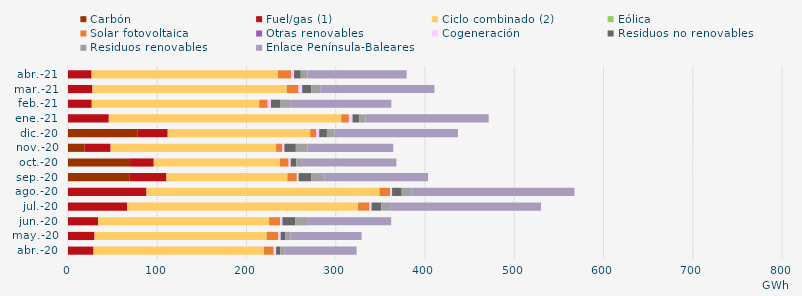
| Category | Carbón | Fuel/gas (1) | Ciclo combinado (2) | Eólica | Solar fotovoltaica | Otras renovables | Cogeneración | Residuos no renovables | Residuos renovables | Enlace Península-Baleares |
|---|---|---|---|---|---|---|---|---|---|---|
| abr.-20 | -1.685 | 28.608 | 190.732 | 0.242 | 10.828 | 0.015 | 2.76 | 4.815 | 4.815 | 80.581 |
| may.-20 | -1.802 | 29.693 | 192.661 | 0.353 | 12.909 | 0.002 | 2.681 | 5.366 | 5.366 | 79.947 |
| jun.-20 | -1.281 | 33.873 | 191.226 | 0.22 | 12.234 | 0.06 | 2.597 | 14.316 | 14.316 | 93.29 |
| jul.-20 | -1.12 | 66.276 | 258.526 | 0.221 | 12.749 | 0.053 | 2.332 | 10.772 | 10.772 | 168.332 |
| ago.-20 | -1.127 | 87.96 | 260.888 | 0.209 | 12.079 | 0.05 | 1.922 | 10.811 | 10.811 | 182.716 |
| sep.-20 | 68.615 | 41.727 | 135.309 | 0.19 | 10.538 | 0.003 | 2.048 | 14.376 | 14.376 | 116.275 |
| oct.-20 | 69.532 | 26.56 | 141.136 | 0.328 | 9.628 | 0.027 | 2.333 | 6.239 | 6.239 | 105.944 |
| nov.-20 | 18.69 | 29.083 | 185.015 | 0.349 | 6.752 | 0.069 | 2.521 | 12.813 | 12.813 | 96.328 |
| dic.-20 | 78.075 | 33.65 | 159.354 | 0.286 | 6.709 | 0.04 | 3.369 | 8.605 | 8.605 | 138.262 |
| ene.-21 | -0.633 | 45.739 | 260.272 | 0.278 | 8.399 | 0.058 | 4.066 | 7.152 | 7.152 | 138.25 |
| feb.-21 | -0.606 | 26.606 | 187.465 | 0.159 | 9.494 | 0.077 | 3.642 | 10.724 | 10.724 | 113.412 |
| mar.-21 | -0.652 | 27.37 | 217.479 | 0.306 | 13.089 | 0.138 | 3.995 | 10.093 | 10.093 | 127.986 |
| abr.-21 | -0.591 | 26.435 | 208.531 | 0.295 | 14.704 | 0.106 | 3.221 | 7.539 | 7.539 | 111.022 |